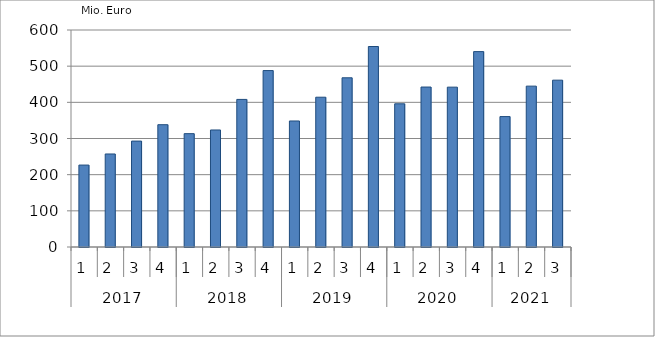
| Category | Ausbaugewerblicher Umsatz3 |
|---|---|
| 0 | 226552.317 |
| 1 | 257191.13 |
| 2 | 292853.372 |
| 3 | 338154.691 |
| 4 | 313433.569 |
| 5 | 323547.694 |
| 6 | 408057.42 |
| 7 | 487843.765 |
| 8 | 348466.115 |
| 9 | 414145.554 |
| 10 | 467849.207 |
| 11 | 554369.34 |
| 12 | 395996.128 |
| 13 | 442270.528 |
| 14 | 441987.109 |
| 15 | 540250.513 |
| 16 | 360578.959 |
| 17 | 444796.964 |
| 18 | 461290.095 |